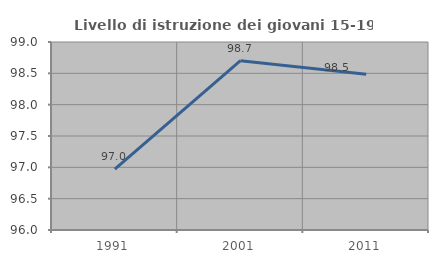
| Category | Livello di istruzione dei giovani 15-19 anni |
|---|---|
| 1991.0 | 96.97 |
| 2001.0 | 98.701 |
| 2011.0 | 98.485 |